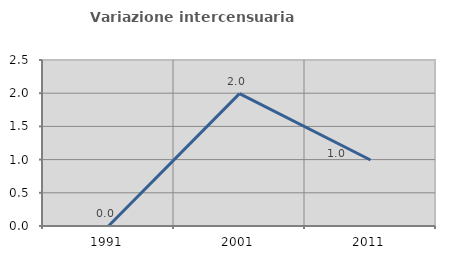
| Category | Variazione intercensuaria annua |
|---|---|
| 1991.0 | 0 |
| 2001.0 | 1.993 |
| 2011.0 | 0.994 |